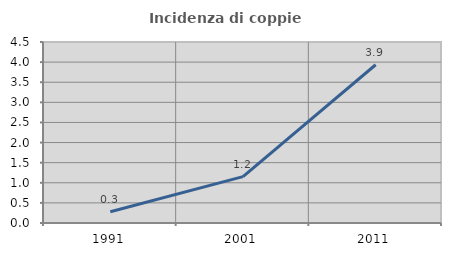
| Category | Incidenza di coppie miste |
|---|---|
| 1991.0 | 0.279 |
| 2001.0 | 1.153 |
| 2011.0 | 3.934 |